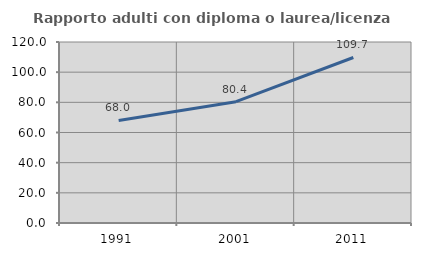
| Category | Rapporto adulti con diploma o laurea/licenza media  |
|---|---|
| 1991.0 | 67.969 |
| 2001.0 | 80.409 |
| 2011.0 | 109.737 |